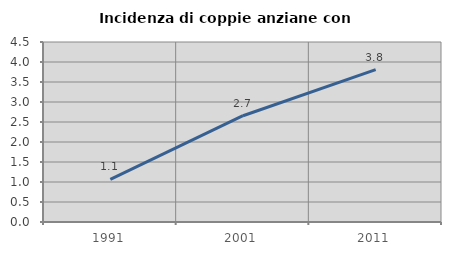
| Category | Incidenza di coppie anziane con figli |
|---|---|
| 1991.0 | 1.067 |
| 2001.0 | 2.657 |
| 2011.0 | 3.81 |